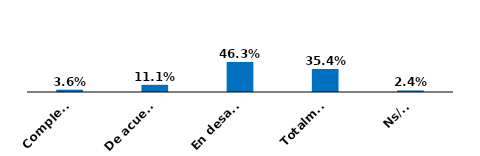
| Category | Series 0 |
|---|---|
| Completamente de acuerdo | 0.036 |
| De acuerdo | 0.111 |
| En desacuerdo | 0.463 |
| Totalmente en desacuerdo | 0.354 |
| Ns/Nr | 0.024 |